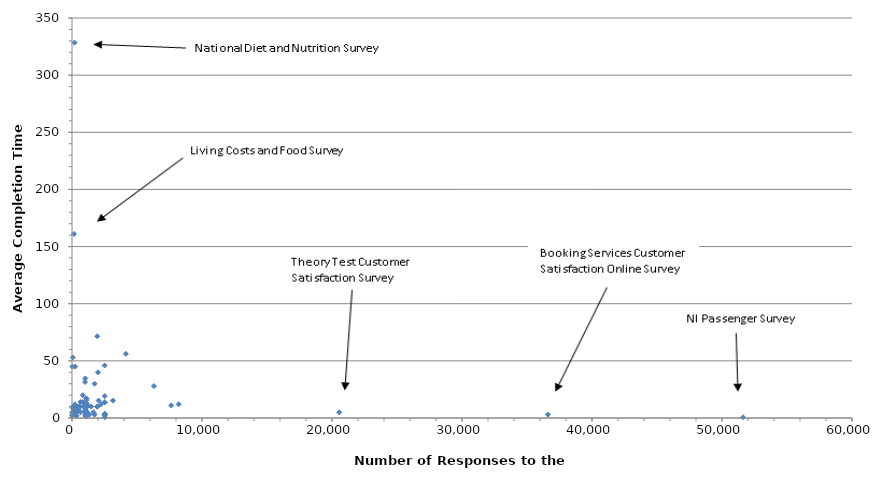
| Category | Series 0 |
|---|---|
| 19.0 | 2 |
| 28.0 | 5 |
| 30.0 | 45 |
| 41.0 | 4 |
| 44.0 | 9 |
| 60.0 | 53 |
| 62.0 | 10 |
| 86.0 | 10 |
| 87.0 | 10 |
| 93.0 | 10 |
| 95.0 | 10 |
| 96.0 | 10 |
| 98.0 | 5 |
| 100.0 | 10 |
| 100.0 | 10 |
| 100.0 | 10 |
| 101.0 | 10 |
| 102.0 | 10 |
| 103.0 | 10 |
| 104.0 | 10 |
| 106.0 | 10 |
| 107.0 | 10 |
| 108.0 | 10 |
| 112.0 | 10 |
| 117.0 | 10 |
| 120.0 | 10 |
| 134.0 | 7 |
| 154.0 | 161 |
| 173.0 | 10 |
| 194.0 | 328.454 |
| 228.0 | 12 |
| 247.0 | 45 |
| 309.0 | 2 |
| 349.0 | 2 |
| 356.0 | 5 |
| 400.0 | 6 |
| 400.0 | 7 |
| 443.0 | 10 |
| 497.0 | 10 |
| 507.0 | 8 |
| 623.0 | 10 |
| 652.0 | 14 |
| 655.0 | 5 |
| 800.0 | 14 |
| 836.0 | 20 |
| 905.0 | 10 |
| 998.0 | 7.05 |
| 1000.0 | 31.5 |
| 1020.0 | 2.659 |
| 1020.0 | 5.319 |
| 1020.0 | 5.851 |
| 1020.0 | 11.705 |
| 1020.0 | 34.573 |
| 1056.0 | 5 |
| 1081.0 | 1.362 |
| 1081.0 | 3.633 |
| 1081.0 | 6.358 |
| 1081.0 | 9.083 |
| 1081.0 | 9.083 |
| 1081.0 | 11.807 |
| 1081.0 | 13.624 |
| 1100.0 | 1.482 |
| 1100.0 | 3.705 |
| 1100.0 | 15.561 |
| 1100.0 | 17.043 |
| 1114.0 | 4.067 |
| 1114.0 | 4.067 |
| 1114.0 | 5.693 |
| 1114.0 | 13.013 |
| 1114.0 | 17.08 |
| 1200.0 | 4 |
| 1211.0 | 10.75 |
| 1211.0 | 10.75 |
| 1335.0 | 3 |
| 1476.0 | 10 |
| 1649.0 | 5 |
| 1736.0 | 3 |
| 1738.0 | 30 |
| 1939.0 | 10 |
| 1939.0 | 10 |
| 1939.0 | 10 |
| 1945.0 | 71.499 |
| 2000.0 | 40 |
| 2048.0 | 15.234 |
| 2228.0 | 12 |
| 2511.0 | 46 |
| 2521.0 | 0.599 |
| 2521.0 | 2.396 |
| 2521.0 | 2.996 |
| 2521.0 | 3.595 |
| 2521.0 | 3.595 |
| 2521.0 | 13.78 |
| 2521.0 | 13.78 |
| 2521.0 | 19.172 |
| 3152.0 | 15.228 |
| 4144.0 | 56.121 |
| 6300.0 | 27.907 |
| 7638.0 | 11 |
| 8208.0 | 12 |
| 20557.0 | 5 |
| 36602.0 | 3 |
| 51617.0 | 0.658 |